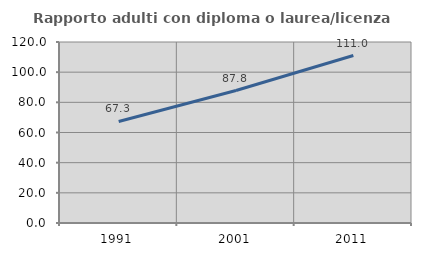
| Category | Rapporto adulti con diploma o laurea/licenza media  |
|---|---|
| 1991.0 | 67.308 |
| 2001.0 | 87.836 |
| 2011.0 | 111.045 |